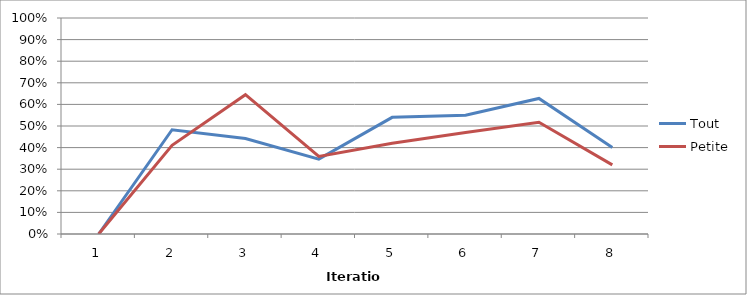
| Category | Tout | Petite |
|---|---|---|
| 0 | 0 | 0 |
| 1 | 0.483 | 0.41 |
| 2 | 0.442 | 0.645 |
| 3 | 0.347 | 0.359 |
| 4 | 0.54 | 0.42 |
| 5 | 0.55 | 0.47 |
| 6 | 0.627 | 0.517 |
| 7 | 0.4 | 0.32 |